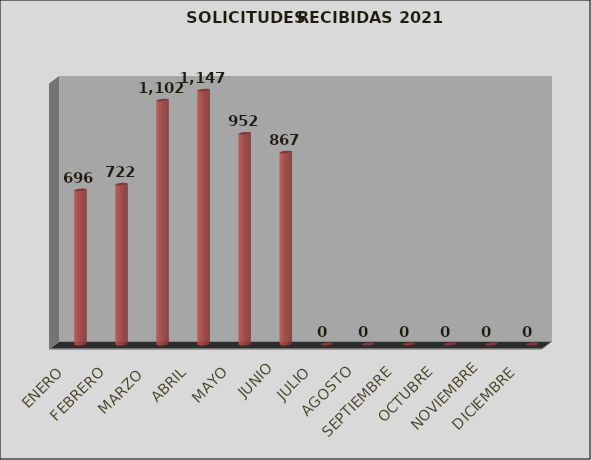
| Category | Series 0 | Series 1 |
|---|---|---|
| ENERO |  | 696 |
| FEBRERO |  | 722 |
| MARZO  |  | 1102 |
| ABRIL |  | 1147 |
| MAYO |  | 952 |
| JUNIO |  | 867 |
| JULIO |  | 0 |
| AGOSTO |  | 0 |
| SEPTIEMBRE |  | 0 |
| OCTUBRE |  | 0 |
| NOVIEMBRE |  | 0 |
| DICIEMBRE |  | 0 |